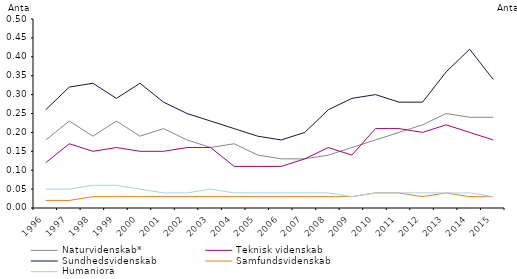
| Category | Naturvidenskab* | Teknisk videnskab | Sundhedsvidenskab | Samfundsvidenskab | Humaniora |
|---|---|---|---|---|---|
| 1996.0 | 0.18 | 0.12 | 0.26 | 0.02 | 0.05 |
| 1997.0 | 0.23 | 0.17 | 0.32 | 0.02 | 0.05 |
| 1998.0 | 0.19 | 0.15 | 0.33 | 0.03 | 0.06 |
| 1999.0 | 0.23 | 0.16 | 0.29 | 0.03 | 0.06 |
| 2000.0 | 0.19 | 0.15 | 0.33 | 0.03 | 0.05 |
| 2001.0 | 0.21 | 0.15 | 0.28 | 0.03 | 0.04 |
| 2002.0 | 0.18 | 0.16 | 0.25 | 0.03 | 0.04 |
| 2003.0 | 0.16 | 0.16 | 0.23 | 0.03 | 0.05 |
| 2004.0 | 0.17 | 0.11 | 0.21 | 0.03 | 0.04 |
| 2005.0 | 0.14 | 0.11 | 0.19 | 0.03 | 0.04 |
| 2006.0 | 0.13 | 0.11 | 0.18 | 0.03 | 0.04 |
| 2007.0 | 0.13 | 0.13 | 0.2 | 0.03 | 0.04 |
| 2008.0 | 0.14 | 0.16 | 0.26 | 0.03 | 0.04 |
| 2009.0 | 0.16 | 0.14 | 0.29 | 0.03 | 0.03 |
| 2010.0 | 0.18 | 0.21 | 0.3 | 0.04 | 0.04 |
| 2011.0 | 0.2 | 0.21 | 0.28 | 0.04 | 0.04 |
| 2012.0 | 0.22 | 0.2 | 0.28 | 0.03 | 0.04 |
| 2013.0 | 0.25 | 0.22 | 0.36 | 0.04 | 0.04 |
| 2014.0 | 0.24 | 0.2 | 0.42 | 0.03 | 0.04 |
| 2015.0 | 0.24 | 0.18 | 0.34 | 0.03 | 0.03 |